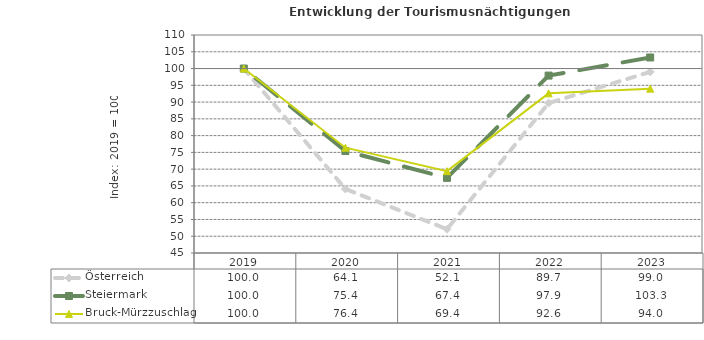
| Category | Österreich | Steiermark | Bruck-Mürzzuschlag |
|---|---|---|---|
| 2023.0 | 99 | 103.3 | 94 |
| 2022.0 | 89.7 | 97.9 | 92.6 |
| 2021.0 | 52.1 | 67.4 | 69.4 |
| 2020.0 | 64.1 | 75.4 | 76.4 |
| 2019.0 | 100 | 100 | 100 |